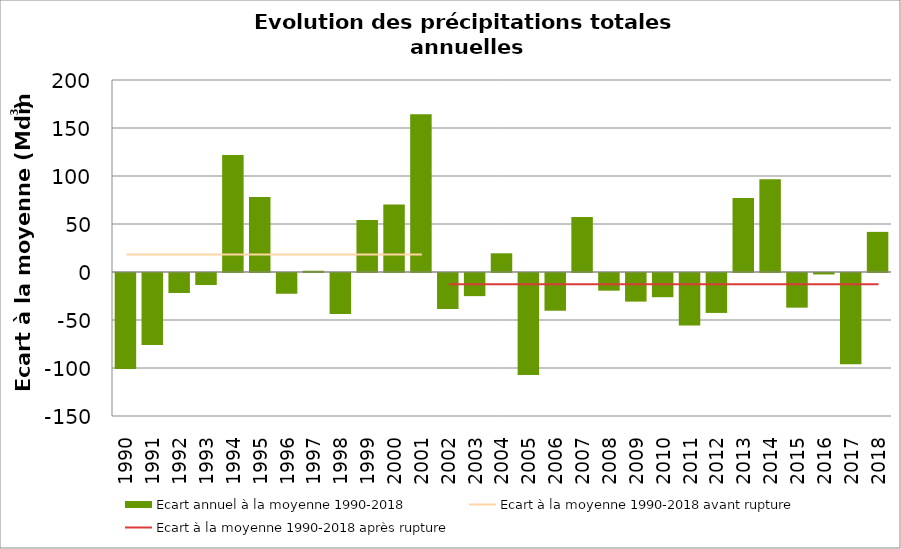
| Category | Ecart annuel à la moyenne 1990-2018 |
|---|---|
| 0 | -100.1 |
| 1 | -75.1 |
| 2 | -20.8 |
| 3 | -12.5 |
| 4 | 122 |
| 5 | 78 |
| 6 | -21.6 |
| 7 | 1.3 |
| 8 | -42.8 |
| 9 | 54.2 |
| 10 | 70.4 |
| 11 | 164.3 |
| 12 | -37.5 |
| 13 | -24.1 |
| 14 | 19.5 |
| 15 | -106.3 |
| 16 | -39.3 |
| 17 | 57.4 |
| 18 | -18.4 |
| 19 | -29.8 |
| 20 | -25.2 |
| 21 | -54.8 |
| 22 | -41.6 |
| 23 | 77.1 |
| 24 | 96.5 |
| 25 | -36.1 |
| 26 | -1.5 |
| 27 | -95.1 |
| 28 | 41.8 |